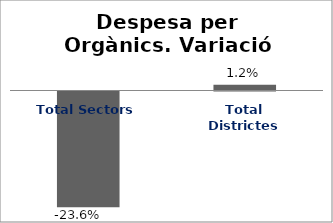
| Category | Series 0 |
|---|---|
| Total Sectors | -0.236 |
| Total Districtes | 0.012 |